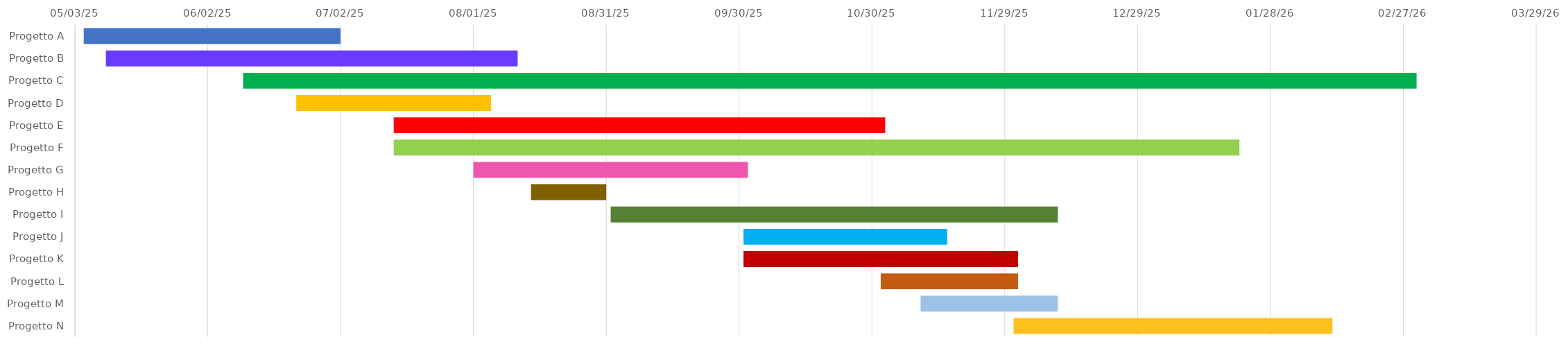
| Category | DATA DI INIZIO | Durata |
|---|---|---|
| Progetto A | 2025-05-05 | 58 |
| Progetto B | 2025-05-10 | 93 |
| Progetto C | 2025-06-10 | 265 |
| Progetto D | 2025-06-22 | 44 |
| Progetto E | 2025-07-14 | 111 |
| Progetto F | 2025-07-14 | 191 |
| Progetto G | 2025-08-01 | 62 |
| Progetto H | 2025-08-14 | 17 |
| Progetto I | 2025-09-01 | 101 |
| Progetto J | 2025-10-01 | 46 |
| Progetto K | 2025-10-01 | 62 |
| Progetto L | 2025-11-01 | 31 |
| Progetto M | 2025-11-10 | 31 |
| Progetto N | 2025-12-01 | 72 |